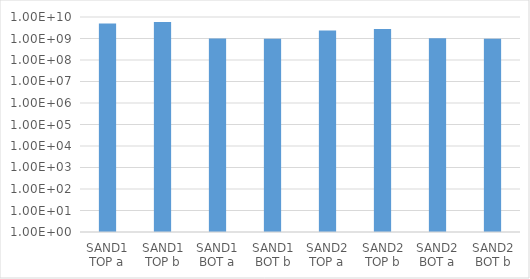
| Category | Series 0 |
|---|---|
| SAND1 TOP a | 5023830508.475 |
| SAND1 TOP b | 5822142857.143 |
| SAND1 BOT a | 1004218039.216 |
| SAND1 BOT b | 975626666.667 |
| SAND2 TOP a | 2366100000 |
| SAND2 TOP b | 2791066666.667 |
| SAND2 BOT a | 1027217931.034 |
| SAND2 BOT b | 971775200 |